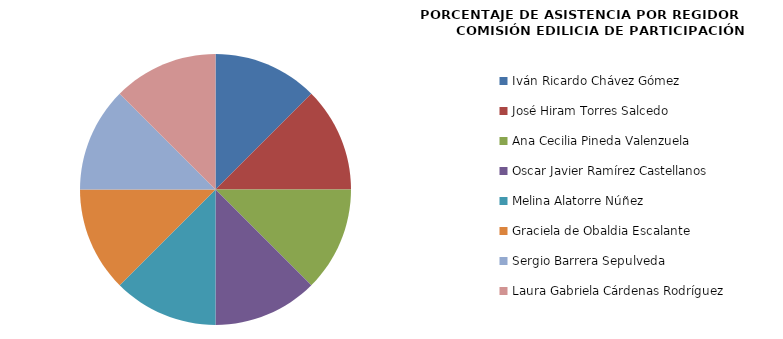
| Category | Series 0 |
|---|---|
| Iván Ricardo Chávez Gómez | 100 |
| José Hiram Torres Salcedo | 100 |
| Ana Cecilia Pineda Valenzuela | 100 |
| Oscar Javier Ramírez Castellanos | 100 |
| Melina Alatorre Núñez | 100 |
| Graciela de Obaldia Escalante | 100 |
| Sergio Barrera Sepulveda | 100 |
| Laura Gabriela Cárdenas Rodríguez | 100 |